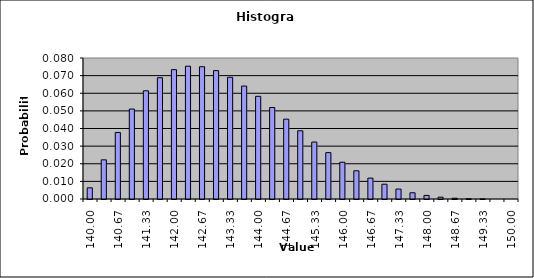
| Category | DISTRIBUTION SCHEDULE |
|---|---|
| 140.0 | 0.006 |
| 140.33333333333334 | 0.022 |
| 140.66666666666669 | 0.038 |
| 141.00000000000003 | 0.051 |
| 141.33333333333337 | 0.061 |
| 141.6666666666667 | 0.069 |
| 142.00000000000006 | 0.073 |
| 142.3333333333334 | 0.075 |
| 142.66666666666674 | 0.075 |
| 143.00000000000009 | 0.073 |
| 143.33333333333343 | 0.069 |
| 143.66666666666677 | 0.064 |
| 144.0000000000001 | 0.058 |
| 144.33333333333346 | 0.052 |
| 144.6666666666668 | 0.045 |
| 145.00000000000014 | 0.039 |
| 145.33333333333348 | 0.032 |
| 145.66666666666683 | 0.026 |
| 146.00000000000017 | 0.021 |
| 146.3333333333335 | 0.016 |
| 146.66666666666686 | 0.012 |
| 147.0000000000002 | 0.008 |
| 147.33333333333354 | 0.006 |
| 147.66666666666688 | 0.004 |
| 148.00000000000023 | 0.002 |
| 148.33333333333357 | 0.001 |
| 148.6666666666669 | 0 |
| 149.00000000000026 | 0 |
| 149.3333333333336 | 0 |
| 149.61904761904788 | 0 |
| 150.0 | 0 |